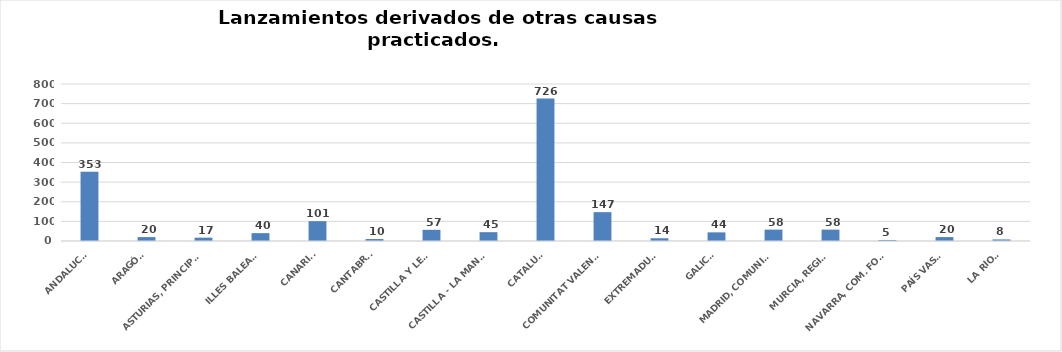
| Category | Series 0 |
|---|---|
| ANDALUCÍA | 353 |
| ARAGÓN | 20 |
| ASTURIAS, PRINCIPADO | 17 |
| ILLES BALEARS | 40 |
| CANARIAS | 101 |
| CANTABRIA | 10 |
| CASTILLA Y LEÓN | 57 |
| CASTILLA - LA MANCHA | 45 |
| CATALUÑA | 726 |
| COMUNITAT VALENCIANA | 147 |
| EXTREMADURA | 14 |
| GALICIA | 44 |
| MADRID, COMUNIDAD | 58 |
| MURCIA, REGIÓN | 58 |
| NAVARRA, COM. FORAL | 5 |
| PAÍS VASCO | 20 |
| LA RIOJA | 8 |